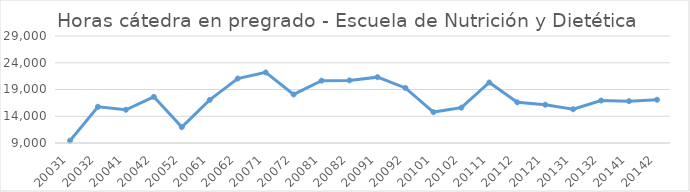
| Category | Total horas |
|---|---|
| 20031 | 9433 |
| 20032 | 15770 |
| 20041 | 15214 |
| 20042 | 17626 |
| 20052 | 11965 |
| 20061 | 17062 |
| 20062 | 21047 |
| 20071 | 22195 |
| 20072 | 18072 |
| 20081 | 20657 |
| 20082 | 20700 |
| 20091 | 21308 |
| 20092 | 19289 |
| 20101 | 14775 |
| 20102 | 15601 |
| 20111 | 20308 |
| 20112 | 16603 |
| 20121 | 16159 |
| 20131 | 15312 |
| 20132 | 16935 |
| 20141 | 16825 |
| 20142 | 17085 |